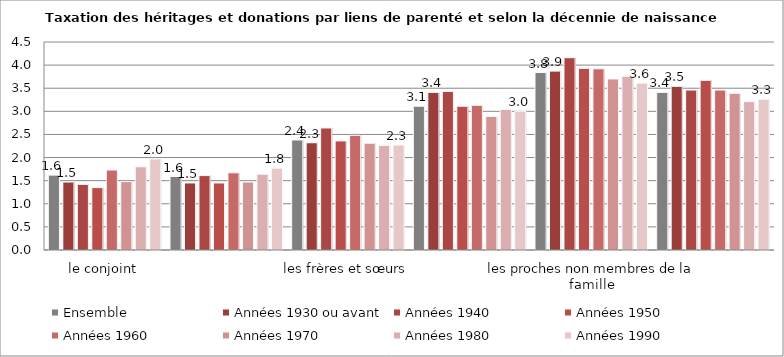
| Category | Ensemble | Années 1930 ou avant | Années 1940 | Années 1950 | Années 1960 | Années 1970 | Années 1980 | Années 1990 |
|---|---|---|---|---|---|---|---|---|
| le conjoint | 1.62 | 1.47 | 1.42 | 1.35 | 1.73 | 1.48 | 1.8 | 1.97 |
| les enfants | 1.59 | 1.45 | 1.61 | 1.45 | 1.67 | 1.47 | 1.64 | 1.77 |
| les frères et sœurs | 2.38 | 2.32 | 2.64 | 2.36 | 2.48 | 2.31 | 2.26 | 2.27 |
| les neveux et nièces | 3.11 | 3.41 | 3.43 | 3.11 | 3.13 | 2.89 | 3.04 | 3 |
| les proches non membres de la famille | 3.84 | 3.87 | 4.16 | 3.93 | 3.92 | 3.7 | 3.76 | 3.61 |
| les associations ou œuvres d'utilité publique | 3.41 | 3.54 | 3.46 | 3.67 | 3.46 | 3.39 | 3.21 | 3.26 |